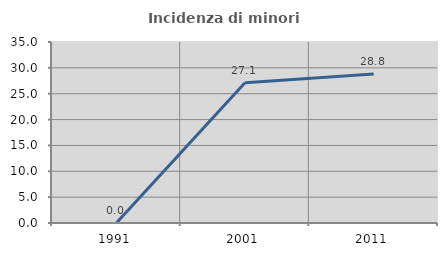
| Category | Incidenza di minori stranieri |
|---|---|
| 1991.0 | 0 |
| 2001.0 | 27.103 |
| 2011.0 | 28.807 |